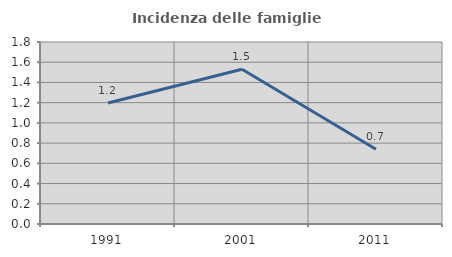
| Category | Incidenza delle famiglie numerose |
|---|---|
| 1991.0 | 1.196 |
| 2001.0 | 1.531 |
| 2011.0 | 0.739 |